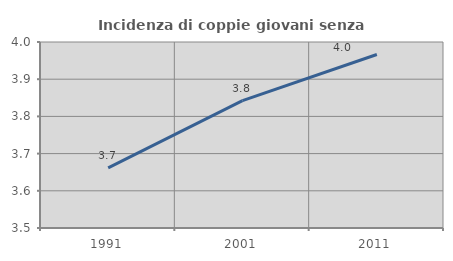
| Category | Incidenza di coppie giovani senza figli |
|---|---|
| 1991.0 | 3.662 |
| 2001.0 | 3.842 |
| 2011.0 | 3.967 |